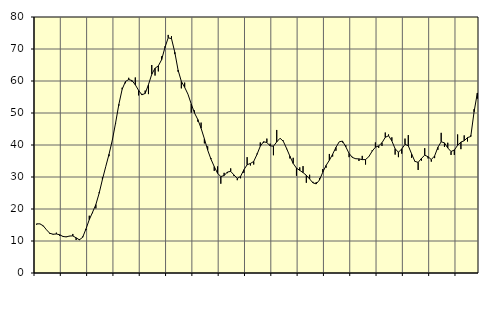
| Category | Piggar | Series 1 |
|---|---|---|
| nan | 15.1 | 15.37 |
| 87.0 | 15.3 | 15.35 |
| 87.0 | 14.6 | 14.76 |
| 87.0 | 13.5 | 13.49 |
| nan | 12.2 | 12.41 |
| 88.0 | 12 | 12.11 |
| 88.0 | 12.6 | 12.19 |
| 88.0 | 11.6 | 11.96 |
| nan | 11.3 | 11.42 |
| 89.0 | 11.4 | 11.27 |
| 89.0 | 11.5 | 11.56 |
| 89.0 | 12.2 | 11.59 |
| nan | 10.3 | 11 |
| 90.0 | 10.6 | 10.37 |
| 90.0 | 11.4 | 11.17 |
| 90.0 | 13.4 | 13.77 |
| nan | 17.9 | 16.67 |
| 91.0 | 18.7 | 18.98 |
| 91.0 | 20.2 | 21.38 |
| 91.0 | 25.2 | 24.92 |
| nan | 29.9 | 29.23 |
| 92.0 | 33.2 | 33.21 |
| 92.0 | 36.5 | 37.09 |
| 92.0 | 41.5 | 41.45 |
| nan | 46.6 | 46.85 |
| 93.0 | 52.3 | 52.72 |
| 93.0 | 57.9 | 57.41 |
| 93.0 | 59.3 | 59.82 |
| nan | 61 | 60.47 |
| 94.0 | 59.8 | 60.13 |
| 94.0 | 61.1 | 58.81 |
| 94.0 | 55.5 | 57.07 |
| nan | 56 | 55.67 |
| 95.0 | 57 | 56.12 |
| 95.0 | 55.9 | 58.87 |
| 95.0 | 65 | 62.09 |
| nan | 61.7 | 63.99 |
| 96.0 | 63 | 64.73 |
| 96.0 | 67.7 | 66.66 |
| 96.0 | 70.8 | 70.43 |
| nan | 74.4 | 73.5 |
| 97.0 | 74 | 73.25 |
| 97.0 | 68.4 | 69.02 |
| 97.0 | 62.9 | 63.42 |
| nan | 57.7 | 59.87 |
| 98.0 | 59.5 | 58.04 |
| 98.0 | 55.9 | 55.9 |
| 98.0 | 50.1 | 52.84 |
| nan | 50.8 | 50 |
| 99.0 | 47.3 | 47.96 |
| 99.0 | 47 | 45.23 |
| 99.0 | 40.5 | 41.94 |
| nan | 39.6 | 38.42 |
| 0.0 | 35.9 | 35.58 |
| 0.0 | 31.9 | 33.25 |
| 0.0 | 33.3 | 31.18 |
| nan | 27.9 | 30.14 |
| 1.0 | 31.3 | 30.45 |
| 1.0 | 31.2 | 31.55 |
| 1.0 | 32.7 | 31.75 |
| nan | 30.3 | 30.64 |
| 2.0 | 29 | 29.56 |
| 2.0 | 29.6 | 30.17 |
| 2.0 | 31.3 | 32.25 |
| nan | 36.2 | 33.83 |
| 3.0 | 33.6 | 34.23 |
| 3.0 | 33.9 | 34.86 |
| 3.0 | 37.3 | 37.07 |
| nan | 40.8 | 39.63 |
| 4.0 | 40.7 | 41.02 |
| 4.0 | 42 | 40.77 |
| 4.0 | 40.4 | 39.73 |
| nan | 36.8 | 39.63 |
| 5.0 | 44.7 | 40.96 |
| 5.0 | 42.1 | 42.11 |
| 5.0 | 41.4 | 41.17 |
| nan | 38.7 | 38.91 |
| 6.0 | 35.8 | 36.51 |
| 6.0 | 36 | 34.23 |
| 6.0 | 30.4 | 32.78 |
| nan | 33 | 32.07 |
| 7.0 | 33.4 | 31.38 |
| 7.0 | 28.2 | 30.53 |
| 7.0 | 30.7 | 29.38 |
| nan | 28.5 | 28.18 |
| 8.0 | 28.4 | 27.85 |
| 8.0 | 29.7 | 29.06 |
| 8.0 | 32.5 | 31.49 |
| nan | 32.9 | 33.6 |
| 9.0 | 37.2 | 35.23 |
| 9.0 | 36.4 | 37.13 |
| 9.0 | 38.2 | 39.25 |
| nan | 41 | 41 |
| 10.0 | 40.8 | 41.22 |
| 10.0 | 39.9 | 39.43 |
| 10.0 | 36.2 | 37.36 |
| nan | 36.3 | 36.11 |
| 11.0 | 35.8 | 35.71 |
| 11.0 | 35 | 35.66 |
| 11.0 | 36.6 | 35.43 |
| nan | 33.9 | 35.45 |
| 12.0 | 36.4 | 36.35 |
| 12.0 | 38.3 | 38.05 |
| 12.0 | 40.8 | 39.31 |
| nan | 39.1 | 39.72 |
| 13.0 | 39.7 | 40.7 |
| 13.0 | 43.9 | 42.39 |
| 13.0 | 43.3 | 42.89 |
| nan | 42.4 | 41.26 |
| 14.0 | 37 | 38.83 |
| 14.0 | 36.2 | 37.74 |
| 14.0 | 37.3 | 38.77 |
| nan | 42 | 40.2 |
| 15.0 | 43.1 | 39.77 |
| 15.0 | 36 | 37.25 |
| 15.0 | 34.8 | 34.89 |
| nan | 32.2 | 34.57 |
| 16.0 | 35.1 | 35.82 |
| 16.0 | 39 | 36.82 |
| 16.0 | 35.8 | 36.34 |
| nan | 34.8 | 35.46 |
| 17.0 | 35.9 | 36.57 |
| 17.0 | 38.5 | 39.28 |
| 17.0 | 43.8 | 41.01 |
| nan | 39.4 | 40.66 |
| 18.0 | 40.7 | 39.07 |
| 18.0 | 36.9 | 37.96 |
| 18.0 | 36.9 | 38.44 |
| nan | 43.3 | 39.9 |
| 19.0 | 38.7 | 40.92 |
| 19.0 | 43 | 41.32 |
| 19.0 | 41.1 | 42.31 |
| nan | 43 | 42.66 |
| 20.0 | 51.2 | 50.37 |
| 20.0 | 54.5 | 56.26 |